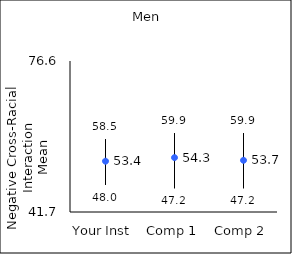
| Category | 25th percentile | 75th percentile | Mean |
|---|---|---|---|
| Your Inst | 48 | 58.5 | 53.44 |
| Comp 1 | 47.2 | 59.9 | 54.27 |
| Comp 2 | 47.2 | 59.9 | 53.65 |